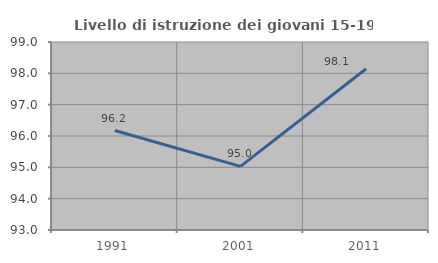
| Category | Livello di istruzione dei giovani 15-19 anni |
|---|---|
| 1991.0 | 96.175 |
| 2001.0 | 95.031 |
| 2011.0 | 98.148 |